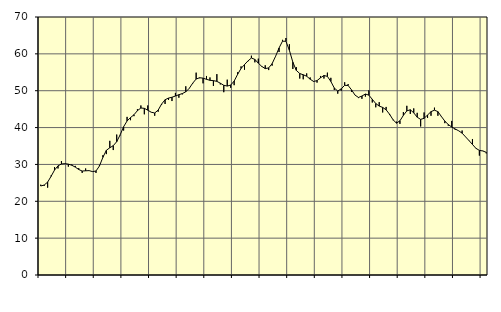
| Category | Piggar | Series 1 |
|---|---|---|
| nan | 24.5 | 24.15 |
| 87.0 | 24.2 | 24.41 |
| 87.0 | 23.7 | 25.2 |
| 87.0 | 27 | 26.77 |
| nan | 29.3 | 28.47 |
| 88.0 | 28.9 | 29.61 |
| 88.0 | 30.9 | 30.12 |
| 88.0 | 30.2 | 30.22 |
| nan | 29.4 | 30.08 |
| 89.0 | 30 | 29.78 |
| 89.0 | 29.6 | 29.28 |
| 89.0 | 29 | 28.62 |
| nan | 27.7 | 28.21 |
| 90.0 | 28.9 | 28.27 |
| 90.0 | 28.3 | 28.32 |
| 90.0 | 28.1 | 28.05 |
| nan | 27.7 | 28.22 |
| 91.0 | 29.8 | 29.57 |
| 91.0 | 32.5 | 31.93 |
| 91.0 | 32.8 | 33.83 |
| nan | 36.4 | 34.52 |
| 92.0 | 33.9 | 35.09 |
| 92.0 | 38.1 | 36.17 |
| 92.0 | 37.9 | 38.03 |
| nan | 39.2 | 40.23 |
| 93.0 | 42.9 | 41.79 |
| 93.0 | 42 | 42.71 |
| 93.0 | 43.1 | 43.48 |
| nan | 45 | 44.59 |
| 94.0 | 46 | 45.31 |
| 94.0 | 43.6 | 45.22 |
| 94.0 | 46 | 44.72 |
| nan | 44.2 | 44.16 |
| 95.0 | 43.2 | 43.96 |
| 95.0 | 44.3 | 44.74 |
| 95.0 | 46.2 | 46.39 |
| nan | 46.4 | 47.55 |
| 96.0 | 47.5 | 48 |
| 96.0 | 47.2 | 48.23 |
| 96.0 | 49.4 | 48.56 |
| nan | 48.1 | 48.92 |
| 97.0 | 49 | 49.23 |
| 97.0 | 51.2 | 49.7 |
| 97.0 | 50.6 | 50.64 |
| nan | 51.9 | 52.04 |
| 98.0 | 54.9 | 53.17 |
| 98.0 | 53.4 | 53.52 |
| 98.0 | 52 | 53.41 |
| nan | 54 | 53.09 |
| 99.0 | 53.6 | 52.82 |
| 99.0 | 51.3 | 52.73 |
| 99.0 | 54.5 | 52.54 |
| nan | 51.7 | 52.04 |
| 0.0 | 49.6 | 51.47 |
| 0.0 | 53 | 51.26 |
| 0.0 | 50.8 | 51.53 |
| nan | 51.5 | 52.61 |
| 1.0 | 55 | 54.43 |
| 1.0 | 56.6 | 56.04 |
| 1.0 | 55.7 | 57.09 |
| nan | 58 | 58.08 |
| 2.0 | 59.5 | 58.87 |
| 2.0 | 57.7 | 58.5 |
| 2.0 | 58.7 | 57.47 |
| nan | 56.7 | 56.59 |
| 3.0 | 56.9 | 56 |
| 3.0 | 55.6 | 56.19 |
| 3.0 | 56.8 | 57.35 |
| nan | 59.4 | 59.34 |
| 4.0 | 60.5 | 61.59 |
| 4.0 | 63.8 | 63.43 |
| 4.0 | 64.3 | 63.42 |
| nan | 62.6 | 60.95 |
| 5.0 | 55.9 | 57.74 |
| 5.0 | 56.4 | 55.51 |
| 5.0 | 53.3 | 54.66 |
| nan | 53.1 | 54.33 |
| 6.0 | 54.7 | 53.93 |
| 6.0 | 53.6 | 53.13 |
| 6.0 | 52.6 | 52.51 |
| nan | 52.2 | 52.74 |
| 7.0 | 54 | 53.5 |
| 7.0 | 53.3 | 54.13 |
| 7.0 | 54.9 | 53.89 |
| nan | 53.5 | 52.51 |
| 8.0 | 50.2 | 50.72 |
| 8.0 | 49.2 | 49.91 |
| 8.0 | 50 | 50.51 |
| nan | 52.3 | 51.46 |
| 9.0 | 51.8 | 51.42 |
| 9.0 | 49.7 | 50.22 |
| 9.0 | 48.8 | 48.81 |
| nan | 48 | 48.17 |
| 10.0 | 47.8 | 48.56 |
| 10.0 | 48.4 | 49.1 |
| 10.0 | 50.1 | 48.8 |
| nan | 46.8 | 47.67 |
| 11.0 | 45.5 | 46.52 |
| 11.0 | 46.9 | 45.83 |
| 11.0 | 44.1 | 45.47 |
| nan | 45.6 | 44.81 |
| 12.0 | 43.4 | 43.62 |
| 12.0 | 42 | 42.13 |
| 12.0 | 41.6 | 41.2 |
| nan | 41 | 41.84 |
| 13.0 | 44.2 | 43.31 |
| 13.0 | 45.9 | 44.53 |
| 13.0 | 43.7 | 44.83 |
| nan | 45.2 | 44 |
| 14.0 | 44 | 42.81 |
| 14.0 | 40.3 | 42.22 |
| 14.0 | 44.1 | 42.51 |
| nan | 42.6 | 43.41 |
| 15.0 | 43.2 | 44.32 |
| 15.0 | 45.4 | 44.72 |
| 15.0 | 43.2 | 44.33 |
| nan | 43.1 | 43.01 |
| 16.0 | 41.2 | 41.75 |
| 16.0 | 40.5 | 40.83 |
| 16.0 | 41.8 | 40.14 |
| nan | 39.4 | 39.62 |
| 17.0 | 39.1 | 39.13 |
| 17.0 | 39.2 | 38.49 |
| 17.0 | 37.5 | 37.48 |
| nan | 36.4 | 36.47 |
| 18.0 | 36.9 | 35.42 |
| 18.0 | 34.3 | 34.37 |
| 18.0 | 32.4 | 33.81 |
| nan | 33.7 | 33.65 |
| 19.0 | 33 | 33.28 |